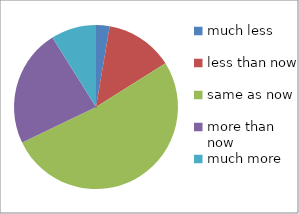
| Category | Series 0 |
|---|---|
| much less | 3 |
| less than now | 15 |
| same as now | 58 |
| more than now | 26 |
| much more | 10 |